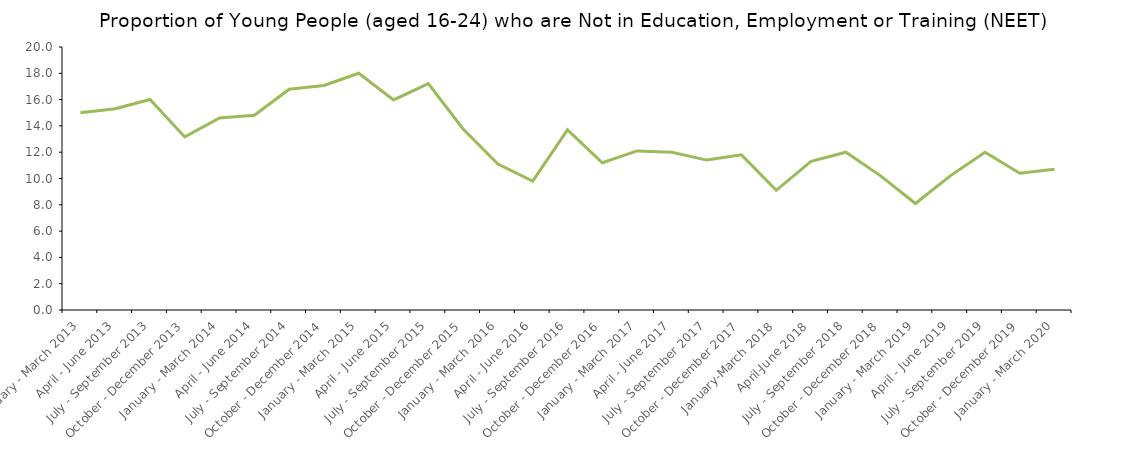
| Category | Series 2 |
|---|---|
| January - March 2013 | 15 |
| April - June 2013 | 15.3 |
| July - September 2013 | 16.006 |
| October - December 2013 | 13.163 |
| January - March 2014 | 14.6 |
| April - June 2014 | 14.811 |
| July - September 2014 | 16.785 |
| October - December 2014 | 17.073 |
| January - March 2015 | 18 |
| April - June 2015 | 15.972 |
| July - September 2015 | 17.216 |
| October - December 2015 | 13.765 |
| January - March 2016 | 11.1 |
| April - June 2016 | 9.8 |
| July - September 2016 | 13.7 |
| October - December 2016 | 11.2 |
| January - March 2017 | 12.1 |
| April - June 2017 | 12 |
| July - September 2017 | 11.4 |
| October - December 2017 | 11.8 |
| January-March 2018 | 9.1 |
| April-June 2018 | 11.3 |
| July - September 2018 | 12 |
| October - December 2018 | 10.2 |
| January - March 2019 | 8.1 |
| April - June 2019 | 10.2 |
| July - September 2019 | 12 |
| October - December 2019 | 10.4 |
| January - March 2020 | 10.7 |